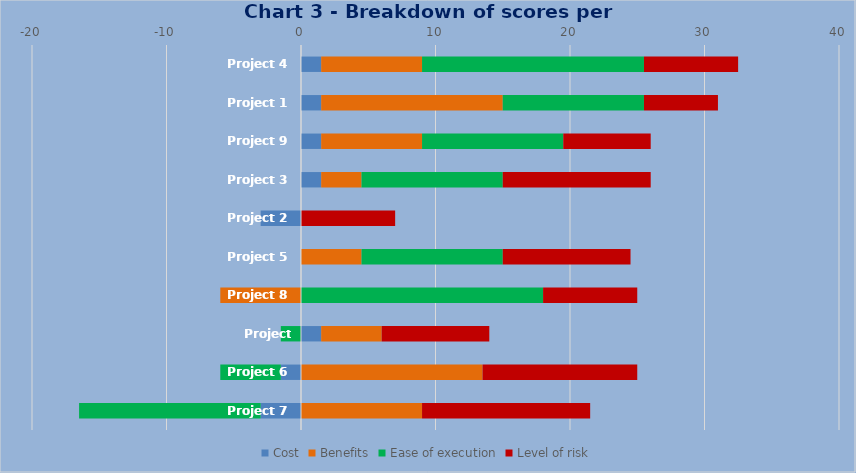
| Category | Cost | Benefits | Ease of execution | Level of risk |
|---|---|---|---|---|
| Project 4 | 1.5 | 7.5 | 16.5 | 7 |
| Project 1 | 1.5 | 13.5 | 10.5 | 5.5 |
| Project 9 | 1.5 | 7.5 | 10.5 | 6.5 |
| Project 3 | 1.5 | 3 | 10.5 | 11 |
| Project 2 | -3 | 0 | 0 | 7 |
| Project 5 | 0 | 4.5 | 10.5 | 9.5 |
| Project 8 | 0 | -6 | 18 | 7 |
| Project 10 | 1.5 | 4.5 | -1.5 | 8 |
| Project 6 | -1.5 | 13.5 | -4.5 | 11.5 |
| Project 7 | -3 | 9 | -13.5 | 12.5 |